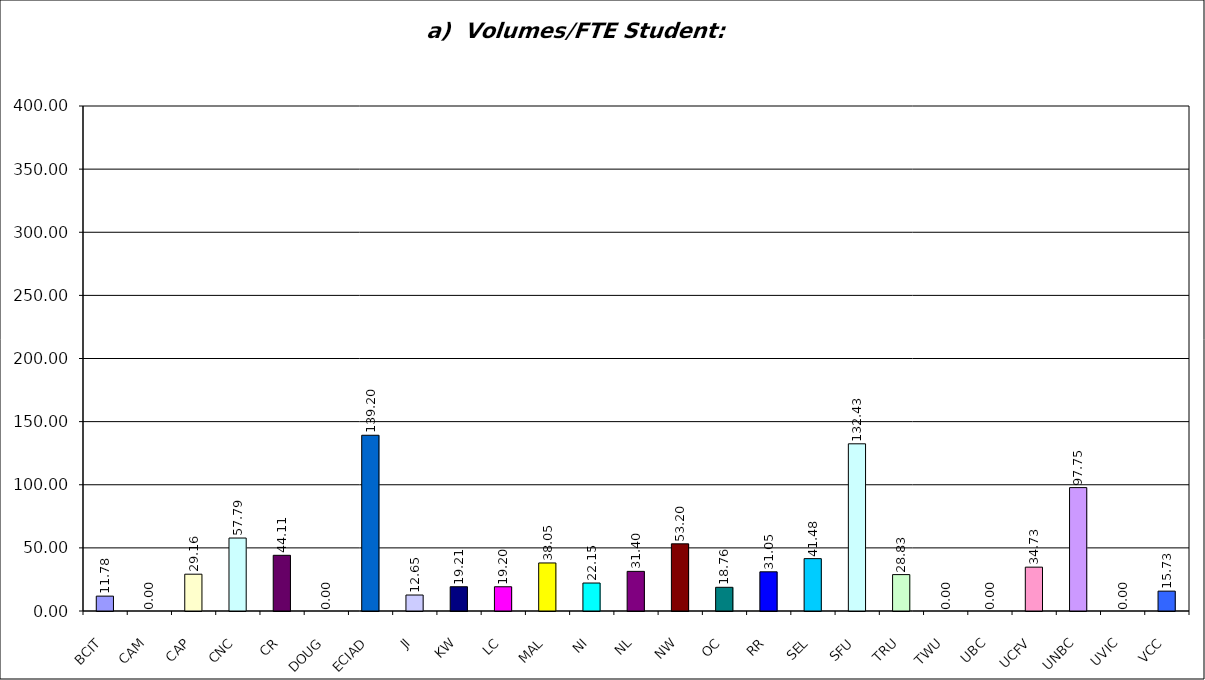
| Category | a)  Volumes/FTE Student:  5(f)/3(a) |
|---|---|
| BCIT | 11.781 |
| CAM | 0 |
| CAP | 29.158 |
| CNC | 57.794 |
| CR | 44.114 |
| DOUG | 0 |
| ECIAD | 139.198 |
| JI | 12.651 |
| KW | 19.212 |
| LC | 19.199 |
| MAL | 38.048 |
| NI | 22.154 |
| NL | 31.398 |
| NW | 53.195 |
| OC | 18.765 |
| RR | 31.048 |
| SEL | 41.477 |
| SFU | 132.43 |
| TRU | 28.826 |
| TWU | 0 |
| UBC | 0 |
| UCFV | 34.734 |
| UNBC | 97.745 |
| UVIC | 0 |
| VCC | 15.731 |